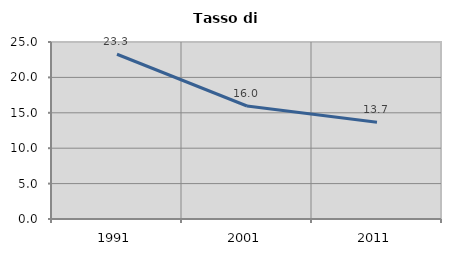
| Category | Tasso di disoccupazione   |
|---|---|
| 1991.0 | 23.269 |
| 2001.0 | 15.959 |
| 2011.0 | 13.663 |